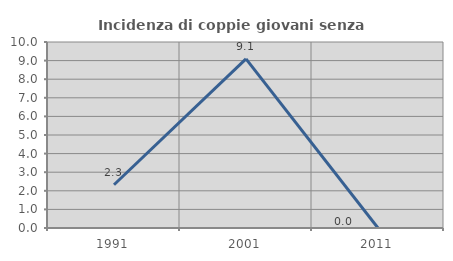
| Category | Incidenza di coppie giovani senza figli |
|---|---|
| 1991.0 | 2.326 |
| 2001.0 | 9.091 |
| 2011.0 | 0 |